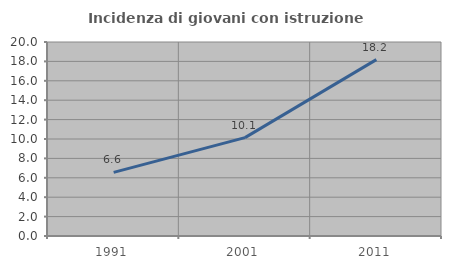
| Category | Incidenza di giovani con istruzione universitaria |
|---|---|
| 1991.0 | 6.557 |
| 2001.0 | 10.145 |
| 2011.0 | 18.182 |